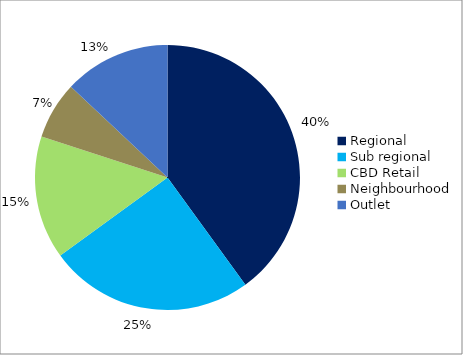
| Category | Series 0 |
|---|---|
| Regional | 0.4 |
| Sub regional | 0.25 |
| CBD Retail | 0.15 |
| Neighbourhood | 0.07 |
| Outlet | 0.13 |